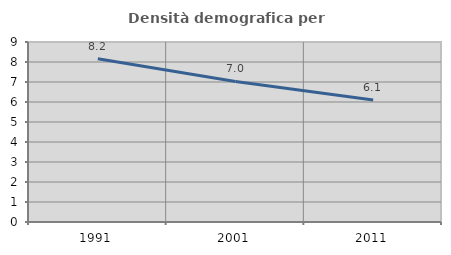
| Category | Densità demografica |
|---|---|
| 1991.0 | 8.163 |
| 2001.0 | 7.026 |
| 2011.0 | 6.096 |